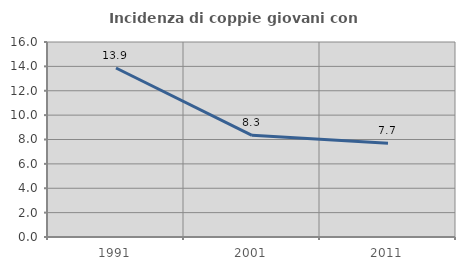
| Category | Incidenza di coppie giovani con figli |
|---|---|
| 1991.0 | 13.864 |
| 2001.0 | 8.34 |
| 2011.0 | 7.698 |